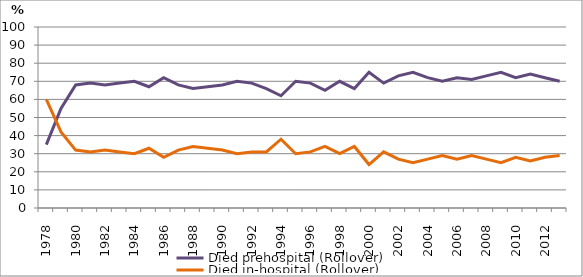
| Category | Died prehospital (Rollover) | Died in-hospital (Rollover) |
|---|---|---|
| 1978.0 | 35 | 60 |
| 1979.0 | 55 | 42 |
| 1980.0 | 68 | 32 |
| 1981.0 | 69 | 31 |
| 1982.0 | 68 | 32 |
| 1983.0 | 69 | 31 |
| 1984.0 | 70 | 30 |
| 1985.0 | 67 | 33 |
| 1986.0 | 72 | 28 |
| 1987.0 | 68 | 32 |
| 1988.0 | 66 | 34 |
| 1989.0 | 67 | 33 |
| 1990.0 | 68 | 32 |
| 1991.0 | 70 | 30 |
| 1992.0 | 69 | 31 |
| 1993.0 | 66 | 31 |
| 1994.0 | 62 | 38 |
| 1995.0 | 70 | 30 |
| 1996.0 | 69 | 31 |
| 1997.0 | 65 | 34 |
| 1998.0 | 70 | 30 |
| 1999.0 | 66 | 34 |
| 2000.0 | 75 | 24 |
| 2001.0 | 69 | 31 |
| 2002.0 | 73 | 27 |
| 2003.0 | 75 | 25 |
| 2004.0 | 72 | 27 |
| 2005.0 | 70 | 29 |
| 2006.0 | 72 | 27 |
| 2007.0 | 71 | 29 |
| 2008.0 | 73 | 27 |
| 2009.0 | 75 | 25 |
| 2010.0 | 72 | 28 |
| 2011.0 | 74 | 26 |
| 2012.0 | 72 | 28 |
| 2013.0 | 70 | 29 |